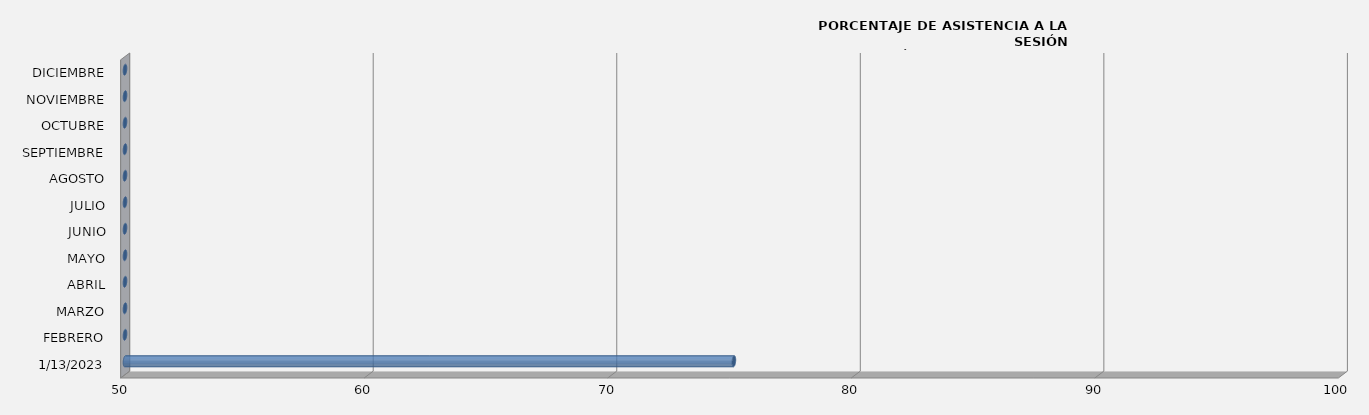
| Category | 13/01/2023 |
|---|---|
| 13/01/2023 | 75 |
| FEBRERO | 0 |
| MARZO | 0 |
| ABRIL | 0 |
| MAYO | 0 |
| JUNIO | 0 |
| JULIO | 0 |
| AGOSTO | 0 |
| SEPTIEMBRE | 0 |
| OCTUBRE | 0 |
| NOVIEMBRE | 0 |
| DICIEMBRE | 0 |